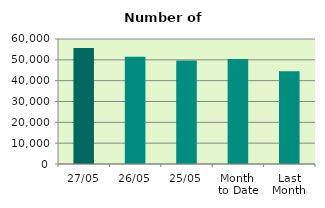
| Category | Series 0 |
|---|---|
| 27/05 | 55654 |
| 26/05 | 51436 |
| 25/05 | 49670 |
| Month 
to Date | 50400.4 |
| Last
Month | 44538 |